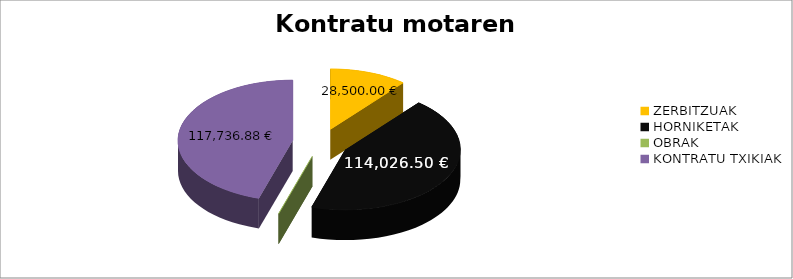
| Category | Kontratu motaren arabera |
|---|---|
| ZERBITZUAK | 28500 |
| HORNIKETAK | 114026.5 |
| OBRAK | 0 |
| KONTRATU TXIKIAK | 117736.88 |